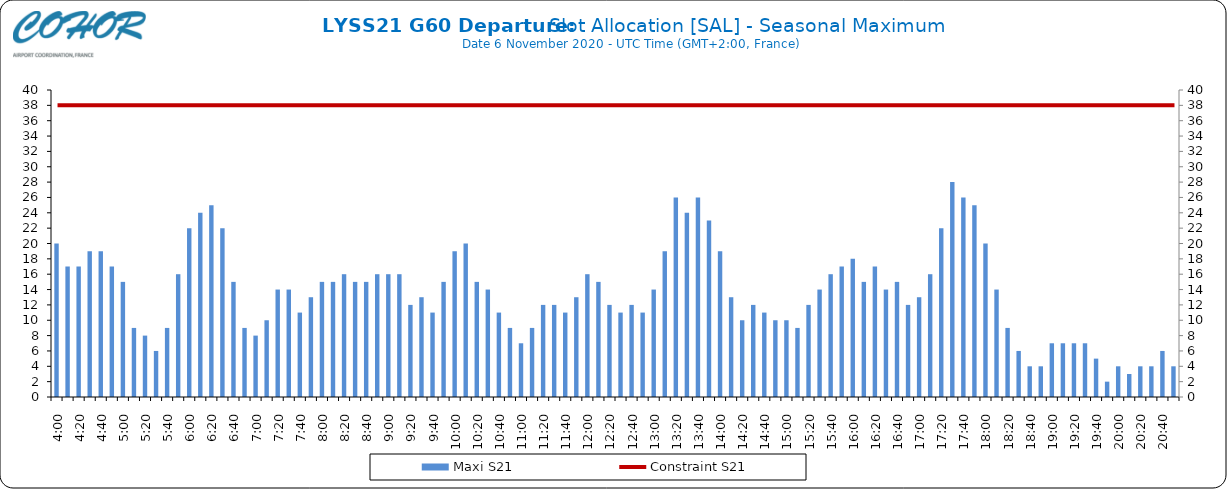
| Category | Maxi S21 |
|---|---|
| 0.16666666666666666 | 20 |
| 0.17361111111111113 | 17 |
| 0.18055555555555555 | 17 |
| 0.1875 | 19 |
| 0.19444444444444445 | 19 |
| 0.20138888888888887 | 17 |
| 0.20833333333333334 | 15 |
| 0.2152777777777778 | 9 |
| 0.2222222222222222 | 8 |
| 0.22916666666666666 | 6 |
| 0.23611111111111113 | 9 |
| 0.24305555555555555 | 16 |
| 0.25 | 22 |
| 0.2569444444444445 | 24 |
| 0.2638888888888889 | 25 |
| 0.2708333333333333 | 22 |
| 0.2777777777777778 | 15 |
| 0.2847222222222222 | 9 |
| 0.2916666666666667 | 8 |
| 0.2986111111111111 | 10 |
| 0.3055555555555555 | 14 |
| 0.3125 | 14 |
| 0.3194444444444445 | 11 |
| 0.3263888888888889 | 13 |
| 0.3333333333333333 | 15 |
| 0.34027777777777773 | 15 |
| 0.34722222222222227 | 16 |
| 0.3541666666666667 | 15 |
| 0.3611111111111111 | 15 |
| 0.3680555555555556 | 16 |
| 0.375 | 16 |
| 0.3819444444444444 | 16 |
| 0.3888888888888889 | 12 |
| 0.3958333333333333 | 13 |
| 0.40277777777777773 | 11 |
| 0.40972222222222227 | 15 |
| 0.4166666666666667 | 19 |
| 0.4236111111111111 | 20 |
| 0.4305555555555556 | 15 |
| 0.4375 | 14 |
| 0.4444444444444444 | 11 |
| 0.4513888888888889 | 9 |
| 0.4583333333333333 | 7 |
| 0.46527777777777773 | 9 |
| 0.47222222222222227 | 12 |
| 0.4791666666666667 | 12 |
| 0.4861111111111111 | 11 |
| 0.4930555555555556 | 13 |
| 0.5 | 16 |
| 0.5069444444444444 | 15 |
| 0.513888888888889 | 12 |
| 0.5208333333333334 | 11 |
| 0.5277777777777778 | 12 |
| 0.5347222222222222 | 11 |
| 0.5416666666666666 | 14 |
| 0.548611111111111 | 19 |
| 0.5555555555555556 | 26 |
| 0.5625 | 24 |
| 0.5694444444444444 | 26 |
| 0.576388888888889 | 23 |
| 0.5833333333333334 | 19 |
| 0.5902777777777778 | 13 |
| 0.5972222222222222 | 10 |
| 0.6041666666666666 | 12 |
| 0.611111111111111 | 11 |
| 0.6180555555555556 | 10 |
| 0.625 | 10 |
| 0.6319444444444444 | 9 |
| 0.638888888888889 | 12 |
| 0.6458333333333334 | 14 |
| 0.6527777777777778 | 16 |
| 0.6597222222222222 | 17 |
| 0.6666666666666666 | 18 |
| 0.6736111111111112 | 15 |
| 0.6805555555555555 | 17 |
| 0.6875 | 14 |
| 0.6944444444444445 | 15 |
| 0.7013888888888888 | 12 |
| 0.7083333333333334 | 13 |
| 0.7152777777777778 | 16 |
| 0.7222222222222222 | 22 |
| 0.7291666666666666 | 28 |
| 0.7361111111111112 | 26 |
| 0.7430555555555555 | 25 |
| 0.75 | 20 |
| 0.7569444444444445 | 14 |
| 0.7638888888888888 | 9 |
| 0.7708333333333334 | 6 |
| 0.7777777777777778 | 4 |
| 0.7847222222222222 | 4 |
| 0.7916666666666666 | 7 |
| 0.7986111111111112 | 7 |
| 0.8055555555555555 | 7 |
| 0.8125 | 7 |
| 0.8194444444444445 | 5 |
| 0.8263888888888888 | 2 |
| 0.8333333333333334 | 4 |
| 0.8402777777777778 | 3 |
| 0.8472222222222222 | 4 |
| 0.8541666666666666 | 4 |
| 0.8611111111111112 | 6 |
| 0.8680555555555555 | 4 |